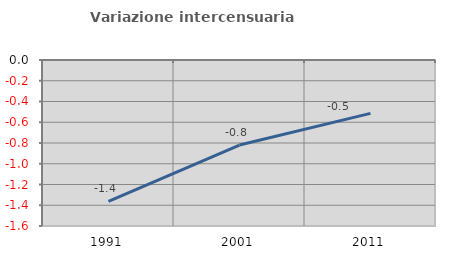
| Category | Variazione intercensuaria annua |
|---|---|
| 1991.0 | -1.363 |
| 2001.0 | -0.82 |
| 2011.0 | -0.515 |